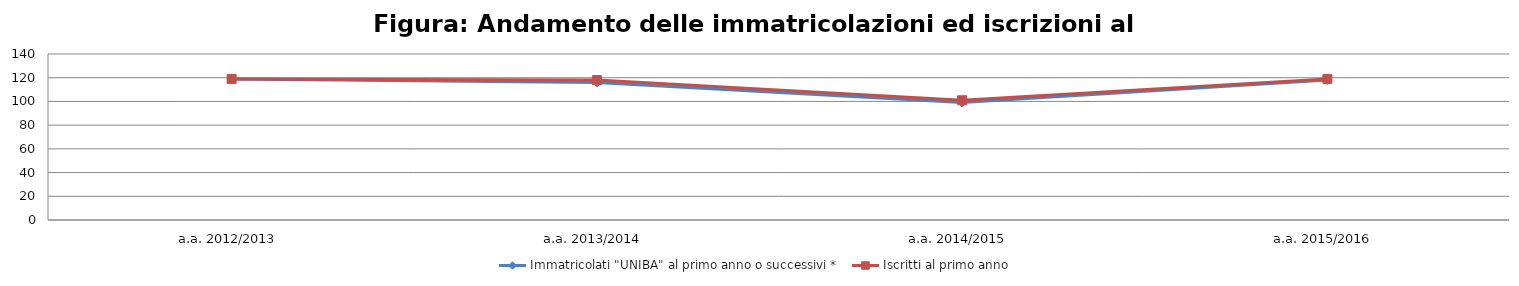
| Category | Immatricolati "UNIBA" al primo anno o successivi * | Iscritti al primo anno  |
|---|---|---|
| a.a. 2012/2013 | 119 | 119 |
| a.a. 2013/2014 | 116 | 118 |
| a.a. 2014/2015 | 99 | 101 |
| a.a. 2015/2016 | 118 | 119 |